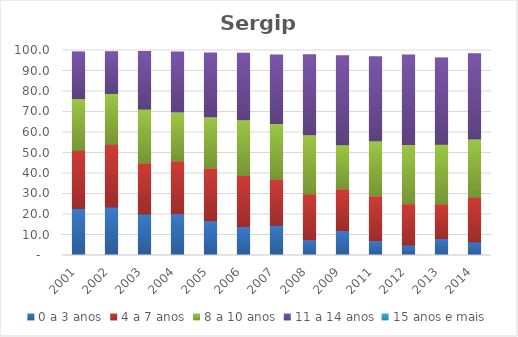
| Category | 0 a 3 anos | 4 a 7 anos | 8 a 10 anos | 11 a 14 anos | 15 anos e mais |
|---|---|---|---|---|---|
| 2001.0 | 22.92 | 28.38 | 25.24 | 22.78 | 0 |
| 2002.0 | 23.6 | 30.66 | 24.79 | 20.36 | 0 |
| 2003.0 | 20.22 | 25 | 26.23 | 28.06 | 0 |
| 2004.0 | 20.3 | 25.89 | 23.86 | 29.19 | 0 |
| 2005.0 | 16.95 | 25.79 | 24.94 | 31.11 | 0 |
| 2006.0 | 14.06 | 25.03 | 27.13 | 32.43 | 0 |
| 2007.0 | 14.72 | 22.42 | 27.29 | 33.41 | 0 |
| 2008.0 | 7.63 | 22.3 | 28.99 | 38.97 | 0 |
| 2009.0 | 12.21 | 20.31 | 21.52 | 43.41 | 0 |
| 2011.0 | 7.28 | 21.83 | 26.82 | 40.97 | 0 |
| 2012.0 | 5.08 | 20.2 | 28.84 | 43.71 | 0 |
| 2013.0 | 8.27 | 16.96 | 29.04 | 42.06 | 0 |
| 2014.0 | 6.58 | 21.78 | 28.49 | 41.51 | 0 |